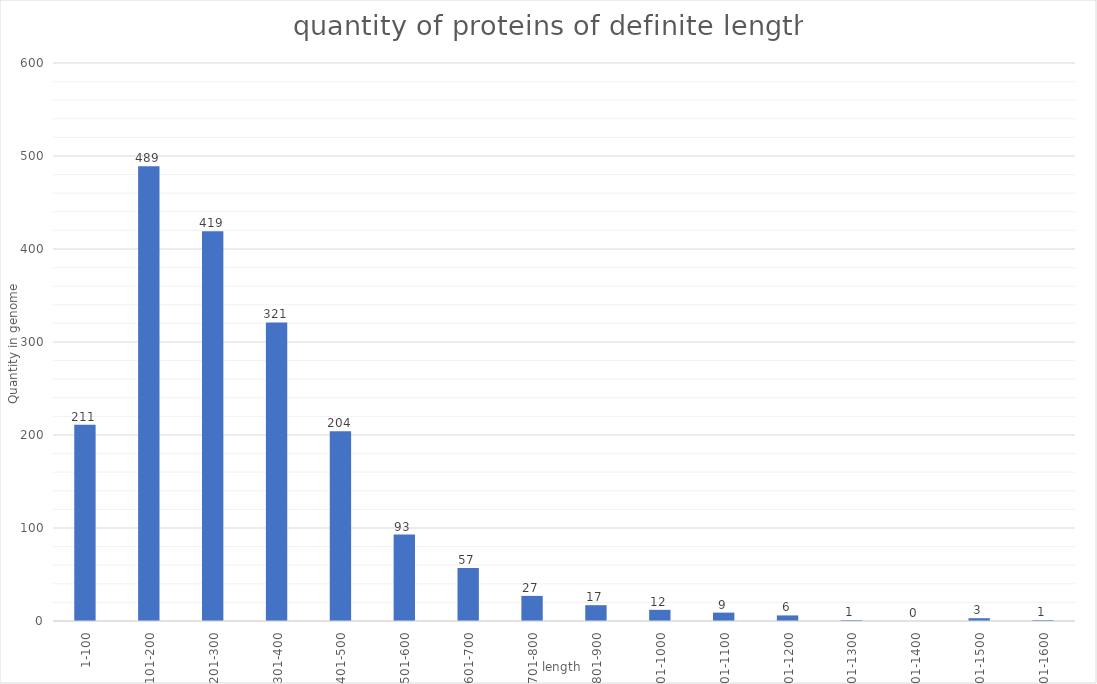
| Category | meaning |
|---|---|
| 1-100 | 211 |
| 101-200 | 489 |
| 201-300 | 419 |
| 301-400 | 321 |
| 401-500 | 204 |
| 501-600 | 93 |
| 601-700 | 57 |
| 701-800 | 27 |
| 801-900 | 17 |
| 901-1000 | 12 |
| 1001-1100 | 9 |
| 1101-1200 | 6 |
| 1201-1300 | 1 |
| 1301-1400 | 0 |
| 1401-1500 | 3 |
| 1501-1600 | 1 |